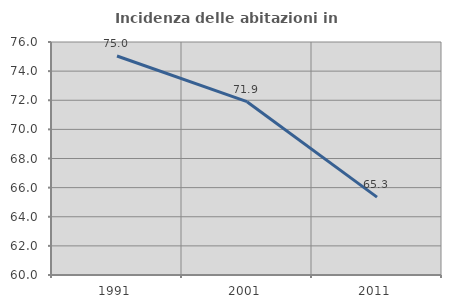
| Category | Incidenza delle abitazioni in proprietà  |
|---|---|
| 1991.0 | 75.04 |
| 2001.0 | 71.9 |
| 2011.0 | 65.348 |